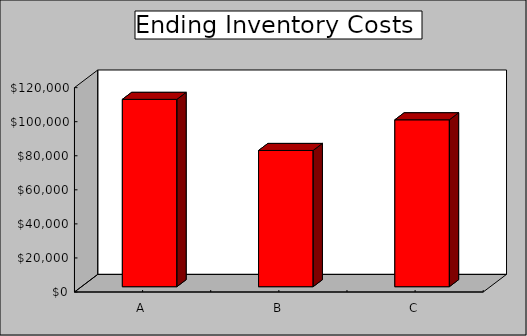
| Category | Series 0 |
|---|---|
| A | 110000 |
| B | 80000 |
| C | 98000 |